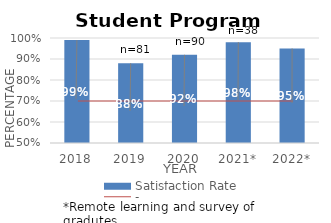
| Category | Satisfaction Rate |
|---|---|
| 2018 | 0.99 |
| 2019 | 0.88 |
| 2020 | 0.92 |
| 2021* | 0.98 |
| 2022* | 0.95 |